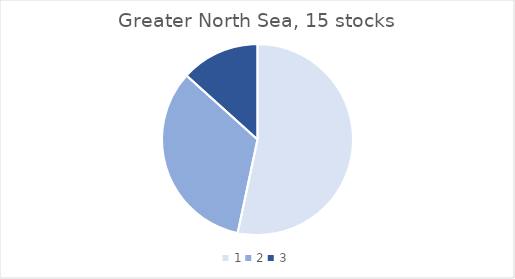
| Category | Greater North Sea |
|---|---|
| 0 | 8 |
| 1 | 5 |
| 2 | 2 |